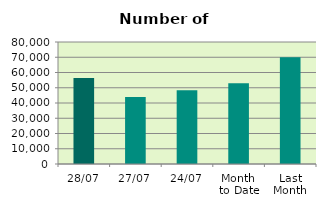
| Category | Series 0 |
|---|---|
| 28/07 | 56430 |
| 27/07 | 43864 |
| 24/07 | 48408 |
| Month 
to Date | 52876.8 |
| Last
Month | 70062.455 |